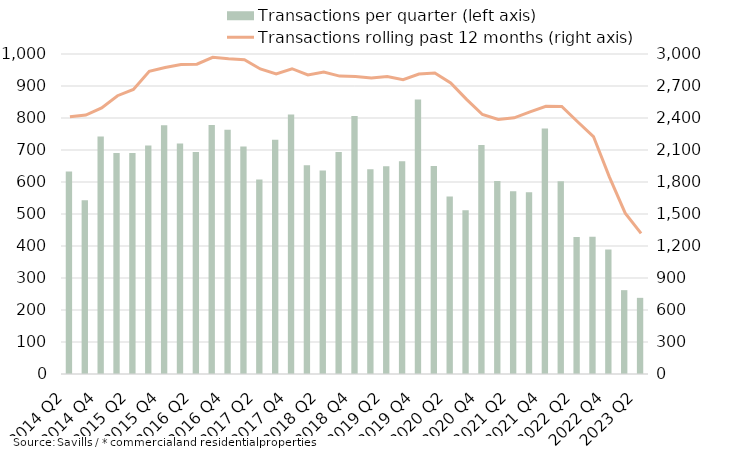
| Category | Transactions per quarter (left axis) |
|---|---|
| 2014 Q2 | 633 |
| 2014 Q3 | 543 |
| 2014 Q4 | 742 |
| 2015 Q1 | 691 |
| 2015 Q2 | 691 |
| 2015 Q3 | 714 |
| 2015 Q4 | 777 |
| 2016 Q1 | 720 |
| 2016 Q2 | 694 |
| 2016 Q3 | 778 |
| 2016 Q4 | 763 |
| 2017 Q1 | 711 |
| 2017 Q2 | 608 |
| 2017 Q3 | 732 |
| 2017 Q4 | 811 |
| 2018 Q1 | 652 |
| 2018 Q2 | 636 |
| 2018 Q3 | 694 |
| 2018 Q4 | 806 |
| 2019 Q1 | 640 |
| 2019 Q2 | 649 |
| 2019 Q3 | 665 |
| 2019 Q4 | 858 |
| 2020 Q1 | 650 |
| 2020 Q2 | 555 |
| 2020 Q3 | 512 |
| 2020 Q4 | 716 |
| 2021 Q1 | 603 |
| 2021 Q2 | 571 |
| 2021 Q3 | 568 |
| 2021 Q4 | 767 |
| 2022 Q1 | 602 |
| 2022 Q2 | 428 |
| 2022 Q3 | 429 |
| 2022 Q4 | 389 |
| 2023 Q1 | 262 |
| 2023 Q2 | 238 |